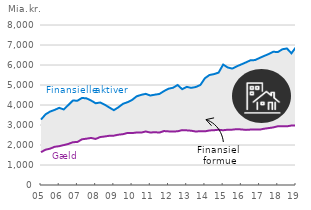
| Category | Finansielle aktiver | Gæld |
|---|---|---|
| 05 | 3272.186 | 1643.093 |
|  | 3532.802 | 1764.809 |
|  | 3672.547 | 1817.598 |
|  | 3755.667 | 1911.022 |
| 06 | 3857.724 | 1942.636 |
|  | 3776.527 | 1996.758 |
|  | 3998.384 | 2053.714 |
|  | 4222.361 | 2138.443 |
| 07 | 4215.558 | 2151.845 |
|  | 4353.072 | 2285.058 |
|  | 4331.642 | 2315.875 |
|  | 4223.693 | 2352.937 |
| 08 | 4088.421 | 2302.067 |
|  | 4123.649 | 2398.769 |
|  | 4014.451 | 2425.657 |
|  | 3875.599 | 2461.751 |
| 09 | 3742.045 | 2467.138 |
|  | 3885.643 | 2515.771 |
|  | 4059.448 | 2540.788 |
|  | 4140.374 | 2601.547 |
| 10 | 4252.82 | 2594.971 |
|  | 4434.044 | 2625.297 |
|  | 4507.349 | 2620.645 |
|  | 4556.922 | 2675.662 |
| 11 | 4474.269 | 2623.007 |
|  | 4515.962 | 2640.884 |
|  | 4552.115 | 2620.915 |
|  | 4694.229 | 2697.12 |
| 12 | 4815.488 | 2681.106 |
|  | 4862.275 | 2675.466 |
|  | 4999.558 | 2684.209 |
|  | 4790.627 | 2743.915 |
| 13 | 4905.401 | 2732.392 |
|  | 4857.483 | 2714.159 |
|  | 4900.307 | 2673.057 |
|  | 5002.555 | 2692.516 |
| 14 | 5338.91 | 2682.556 |
|  | 5500.679 | 2727.766 |
|  | 5544.028 | 2739.008 |
|  | 5619.862 | 2763.566 |
| 15 | 6021.801 | 2737.414 |
|  | 5876.944 | 2764.859 |
|  | 5821.519 | 2766.914 |
|  | 5934.333 | 2792.133 |
| 16 | 6030.619 | 2778.117 |
|  | 6130.009 | 2755.168 |
|  | 6236.124 | 2770.619 |
|  | 6245.605 | 2777.701 |
| 17 | 6352.352 | 2769.171 |
|  | 6453.858 | 2813.937 |
|  | 6546.61 | 2845.542 |
|  | 6663.218 | 2878.636 |
| 18 | 6645.151 | 2935.465 |
|  | 6785.515 | 2935.828 |
|  | 6827.891 | 2932.36 |
|  | 6584.874 | 2973.99 |
| 19 | 6892.491 | 2976.004 |